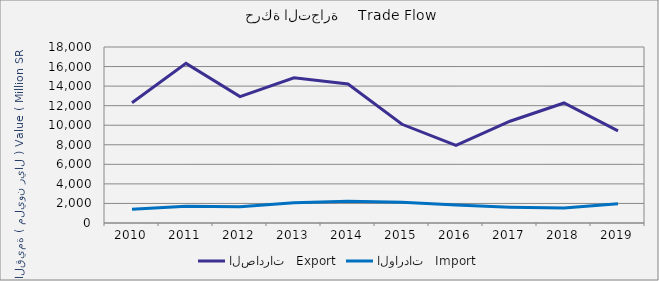
| Category | الصادرات   Export | الواردات   Import |
|---|---|---|
| 2010.0 | 12298437724 | 1394308105 |
| 2011.0 | 16322874172 | 1719174884 |
| 2012.0 | 12932542816 | 1666150490 |
| 2013.0 | 14856420980 | 2067720484 |
| 2014.0 | 14212495367 | 2217222689 |
| 2015.0 | 10096599626 | 2118833846 |
| 2016.0 | 7933962487 | 1828387179 |
| 2017.0 | 10410366204 | 1623375591 |
| 2018.0 | 12275692841 | 1538794702 |
| 2019.0 | 9414415478 | 1977742637 |